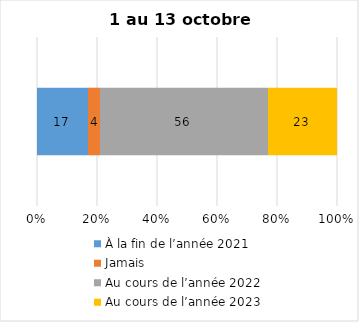
| Category | À la fin de l’année 2021 | Jamais | Au cours de l’année 2022 | Au cours de l’année 2023 |
|---|---|---|---|---|
| 0 | 17 | 4 | 56 | 23 |